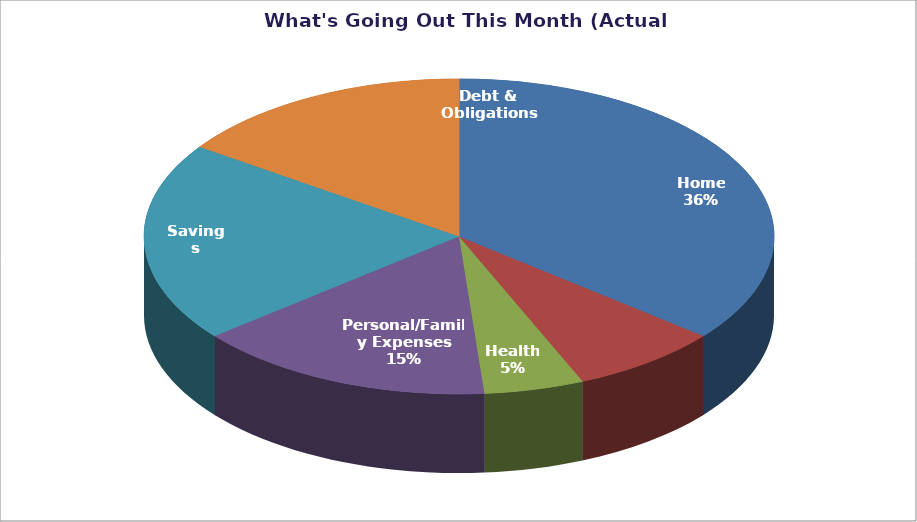
| Category | Series 0 |
|---|---|
| 0 | 700 |
| 1 | 150 |
| 2 | 100 |
| 3 | 300 |
| 4 | 400 |
| 5 | 300 |